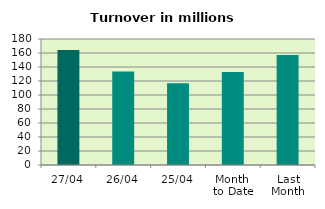
| Category | Series 0 |
|---|---|
| 27/04 | 164.132 |
| 26/04 | 133.518 |
| 25/04 | 116.849 |
| Month 
to Date | 132.919 |
| Last
Month | 157.238 |